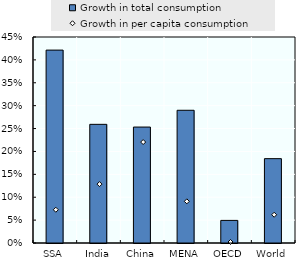
| Category | Growth in total consumption |
|---|---|
| SSA | 0.421 |
| India | 0.259 |
| China | 0.253 |
| MENA | 0.29 |
| OECD | 0.049 |
| World | 0.184 |